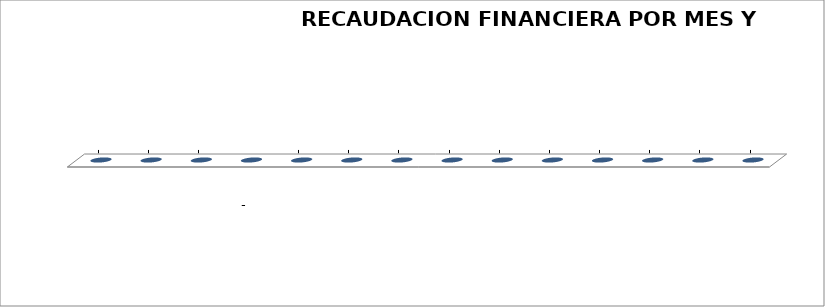
| Category | Series 0 |
|---|---|
|  | 0 |
|  | 0 |
|  | 0 |
|  | 0 |
|  | 0 |
|  | 0 |
|  | 0 |
|  | 0 |
|  | 0 |
|  | 0 |
|  | 0 |
|  | 0 |
|  | 0 |
|  | 0 |